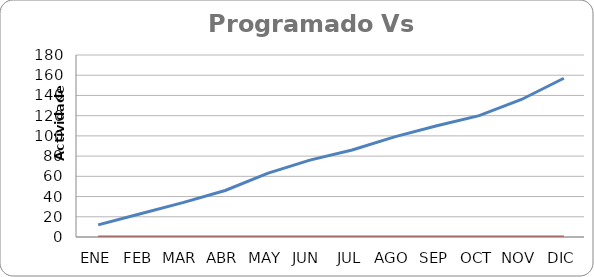
| Category | Programado | Ejecutado |
|---|---|---|
| ENE | 12 | 0 |
| FEB | 23 | 0 |
| MAR | 34 | 0 |
| ABR | 46 | 0 |
| MAY | 63 | 0 |
| JUN | 76 | 0 |
| JUL | 86 | 0 |
| AGO | 99 | 0 |
| SEP | 110 | 0 |
| OCT | 120 | 0 |
| NOV | 136 | 0 |
| DIC | 157 | 0 |